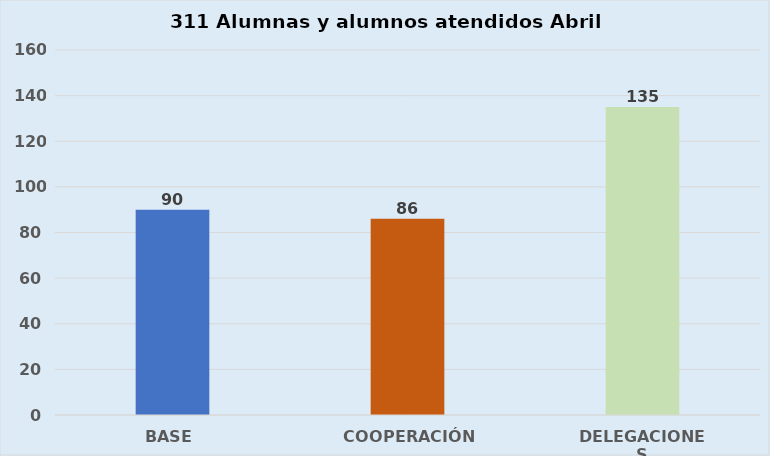
| Category | Series 0 |
|---|---|
| BASE | 90 |
| COOPERACIÓN | 86 |
| DELEGACIONES | 135 |